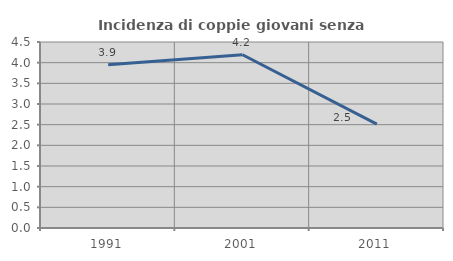
| Category | Incidenza di coppie giovani senza figli |
|---|---|
| 1991.0 | 3.947 |
| 2001.0 | 4.192 |
| 2011.0 | 2.511 |